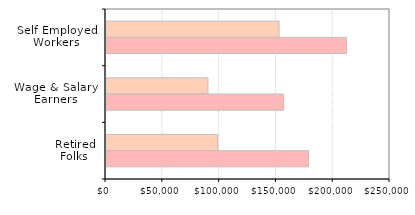
| Category | 2000 | 2010 |
|---|---|---|
| Self Employed
Workers | 152349 | 211598 |
| Wage & Salary
Earners | 89762 | 156410 |
| Retired
Folks | 98233 | 178303 |